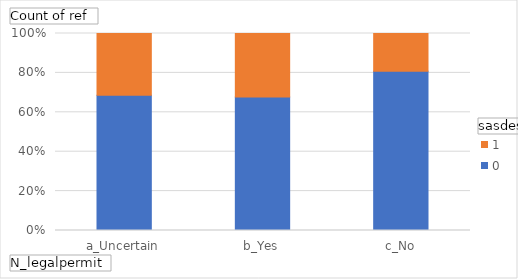
| Category | 0 | 1 |
|---|---|---|
| a_Uncertain | 811 | 370 |
| b_Yes | 233 | 111 |
| c_No | 626 | 149 |